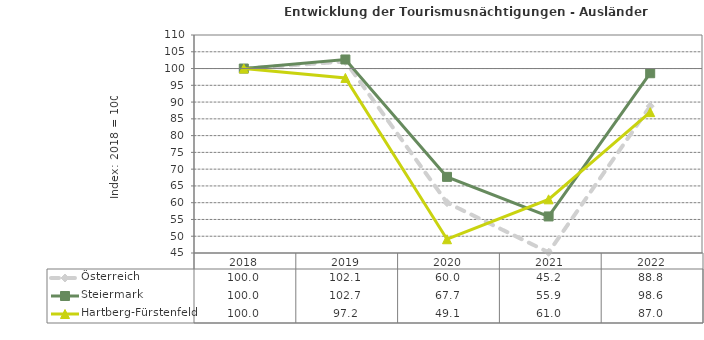
| Category | Österreich | Steiermark | Hartberg-Fürstenfeld |
|---|---|---|---|
| 2022.0 | 88.8 | 98.6 | 87 |
| 2021.0 | 45.2 | 55.9 | 61 |
| 2020.0 | 60 | 67.7 | 49.1 |
| 2019.0 | 102.1 | 102.7 | 97.2 |
| 2018.0 | 100 | 100 | 100 |